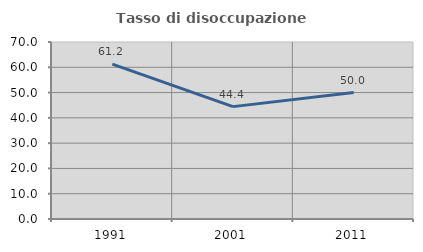
| Category | Tasso di disoccupazione giovanile  |
|---|---|
| 1991.0 | 61.224 |
| 2001.0 | 44.444 |
| 2011.0 | 50 |